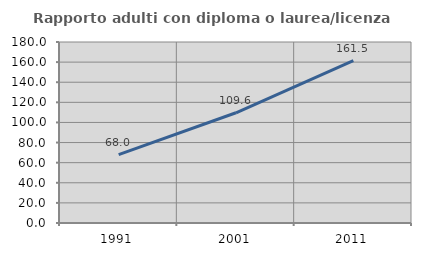
| Category | Rapporto adulti con diploma o laurea/licenza media  |
|---|---|
| 1991.0 | 68.027 |
| 2001.0 | 109.626 |
| 2011.0 | 161.538 |